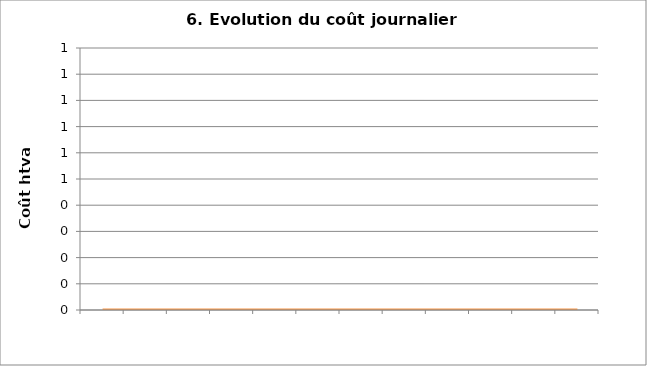
| Category | Coût journalier moyen |
|---|---|
| 0 | 0 |
| 1900-01-01 | 0 |
| 1900-01-02 | 0 |
| 1900-01-03 | 0 |
| 1900-01-04 | 0 |
| 1900-01-05 | 0 |
| 1900-01-06 | 0 |
| 1900-01-07 | 0 |
| 1900-01-08 | 0 |
| 1900-01-09 | 0 |
| 1900-01-10 | 0 |
| 1900-01-11 | 0 |